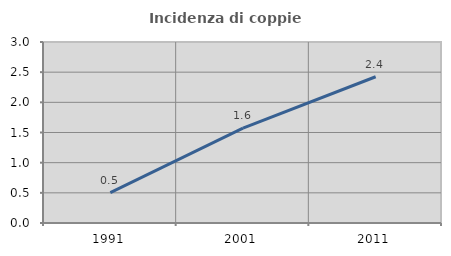
| Category | Incidenza di coppie miste |
|---|---|
| 1991.0 | 0.503 |
| 2001.0 | 1.571 |
| 2011.0 | 2.424 |